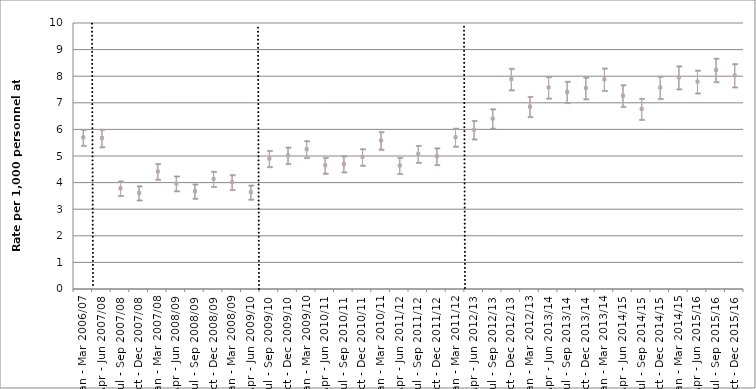
| Category | Rate of patients assessed with a mental disorder | 95% LL | 95% UL |
|---|---|---|---|
| Jan - Mar 2006/07 | 5.7 | 5.4 | 6 |
| Apr - Jun 2007/08 | 5.674 | 5.344 | 6.004 |
| Jul - Sep 2007/08 | 3.787 | 3.517 | 4.058 |
| Oct - Dec 2007/08 | 3.612 | 3.347 | 3.877 |
| Jan - Mar 2007/08 | 4.42 | 4.127 | 4.713 |
| Apr - Jun 2008/09 | 3.97 | 3.691 | 4.248 |
| Jul - Sep 2008/09 | 3.678 | 3.41 | 3.947 |
| Oct - Dec 2008/09 | 4.14 | 3.856 | 4.424 |
| Jan - Mar 2008/09 | 4.016 | 3.737 | 4.295 |
| Apr - Jun 2009/10 | 3.641 | 3.377 | 3.906 |
| Jul - Sep 2009/10 | 4.904 | 4.599 | 5.21 |
| Oct - Dec 2009/10 | 5.024 | 4.716 | 5.332 |
| Jan - Mar 2009/10 | 5.257 | 4.942 | 5.573 |
| Apr - Jun 2010/11 | 4.65 | 4.352 | 4.947 |
| Jul - Sep 2010/11 | 4.703 | 4.402 | 5.003 |
| Oct - Dec 2010/11 | 4.961 | 4.653 | 5.27 |
| Jan - Mar 2010/11 | 5.584 | 5.255 | 5.912 |
| Apr - Jun 2011/12 | 4.641 | 4.34 | 4.942 |
| Jul - Sep 2011/12 | 5.079 | 4.763 | 5.395 |
| Oct - Dec 2011/12 | 4.989 | 4.675 | 5.302 |
| Jan - Mar 2011/12 | 5.705 | 5.368 | 6.043 |
| Apr - Jun 2012/13 | 5.989 | 5.641 | 6.337 |
| Jul - Sep 2012/13 | 6.409 | 6.047 | 6.77 |
| Oct - Dec 2012/13 | 7.892 | 7.487 | 8.296 |
| Jan - Mar 2012/13 | 6.858 | 6.477 | 7.238 |
| Apr - Jun 2013/14 | 7.578 | 7.176 | 7.979 |
| Jul - Sep 2013/14 | 7.408 | 7.008 | 7.808 |
| Oct - Dec 2013/14 | 7.557 | 7.15 | 7.965 |
| Jan - Mar 2013/14 | 7.885 | 7.463 | 8.306 |
| Apr - Jun 2014/15 | 7.27 | 6.864 | 7.676 |
| Jul - Sep 2014/15 | 6.77 | 6.376 | 7.164 |
| Oct - Dec 2014/15 | 7.577 | 7.159 | 7.996 |
| Jan - Mar 2014/15 | 7.953 | 7.522 | 8.385 |
| Apr - Jun 2015/16 | 7.798 | 7.37 | 8.226 |
| Jul - Sep 2015/16 | 8.234 | 7.793 | 8.675 |
| Oct - Dec 2015/16 | 8.031 | 7.595 | 8.467 |